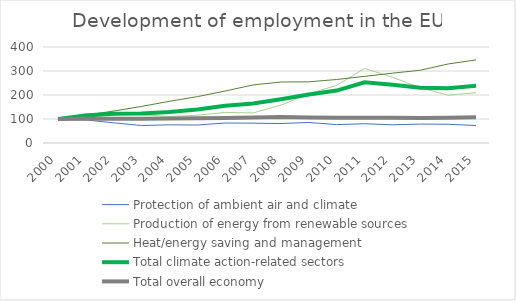
| Category | Protection of ambient air and climate | Production of energy from renewable sources | Heat/energy saving and management | Total climate action-related sectors | Total overall economy |
|---|---|---|---|---|---|
| 2000 | 100 | 100 | 100 | 100 | 100 |
| 2001 | 96.212 | 121.612 | 115.884 | 114.37 | 101 |
| 2002 | 84.091 | 127.839 | 133.213 | 121.554 | 101 |
| 2003 | 72.727 | 117.949 | 152.347 | 123.167 | 101 |
| 2004 | 75.758 | 110.623 | 173.646 | 129.472 | 102 |
| 2005 | 75 | 115.751 | 193.141 | 139.296 | 103 |
| 2006 | 83.333 | 127.473 | 216.606 | 155.132 | 104 |
| 2007 | 82.576 | 125.275 | 241.877 | 164.37 | 106 |
| 2008 | 81.061 | 157.875 | 254.152 | 182.111 | 108 |
| 2009 | 85.606 | 205.128 | 254.874 | 202.199 | 106 |
| 2010 | 76.515 | 240.293 | 264.621 | 218.475 | 105 |
| 2011 | 80.303 | 310.623 | 277.617 | 252.639 | 105 |
| 2012 | 75.758 | 273.993 | 290.975 | 242.522 | 105 |
| 2013 | 78.788 | 230.037 | 303.249 | 230.499 | 104 |
| 2014 | 78.03 | 199.267 | 329.242 | 228.592 | 105 |
| 2015 | 72.727 | 209.524 | 346.209 | 238.563 | 107 |